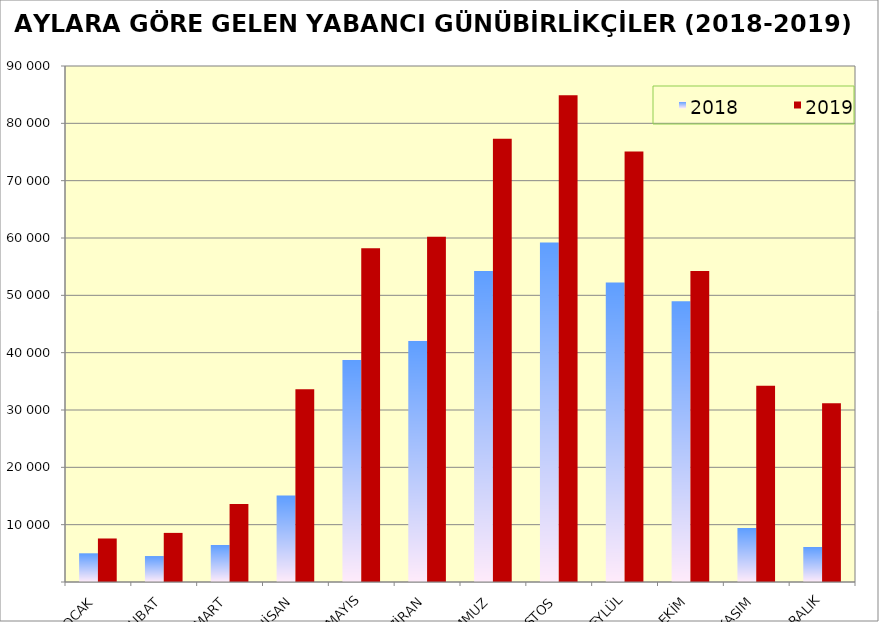
| Category | 2018 | 2019 |
|---|---|---|
| OCAK | 5005 | 7589 |
| ŞUBAT | 4526 | 8565 |
| MART | 6473 | 13594 |
| NİSAN | 15107 | 33640 |
| MAYIS | 38777 | 58228 |
| HAZİRAN | 42111 | 60198 |
| TEMMUZ | 54250 | 77293 |
| AĞUSTOS | 59217 | 84888 |
| EYLÜL | 52254 | 75094 |
| EKİM | 48989 | 54225 |
| KASIM | 9407 | 34240 |
| ARALIK | 6114 | 31164 |